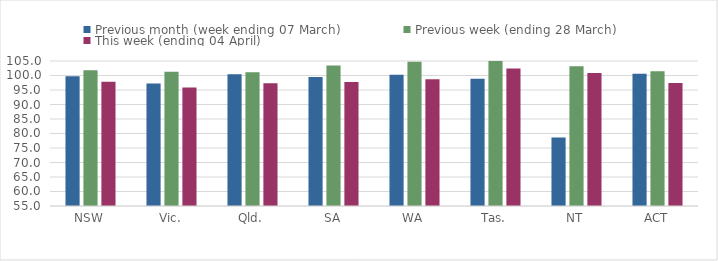
| Category | Previous month (week ending 07 March) | Previous week (ending 28 March) | This week (ending 04 April) |
|---|---|---|---|
| NSW | 99.746 | 101.796 | 97.804 |
| Vic. | 97.251 | 101.283 | 95.842 |
| Qld. | 100.456 | 101.11 | 97.337 |
| SA | 99.514 | 103.464 | 97.716 |
| WA | 100.289 | 104.741 | 98.681 |
| Tas. | 98.909 | 105.185 | 102.428 |
| NT | 78.588 | 103.161 | 100.831 |
| ACT | 100.58 | 101.463 | 97.376 |